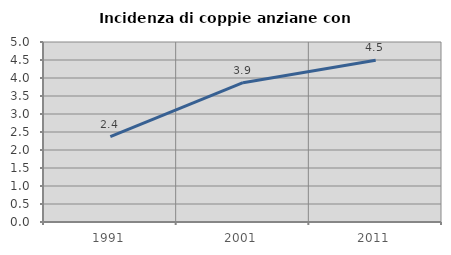
| Category | Incidenza di coppie anziane con figli |
|---|---|
| 1991.0 | 2.374 |
| 2001.0 | 3.871 |
| 2011.0 | 4.493 |